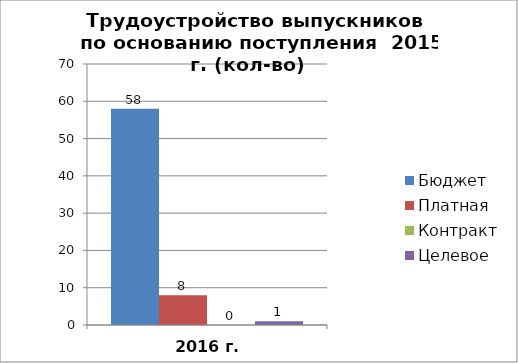
| Category | Бюджет | Платная | Контракт | Целевое |
|---|---|---|---|---|
| 2016 г. | 58 | 8 | 0 | 1 |